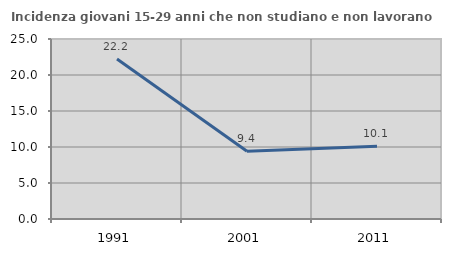
| Category | Incidenza giovani 15-29 anni che non studiano e non lavorano  |
|---|---|
| 1991.0 | 22.222 |
| 2001.0 | 9.406 |
| 2011.0 | 10.119 |